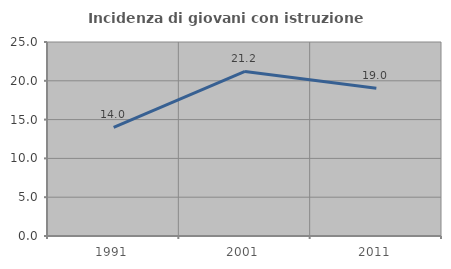
| Category | Incidenza di giovani con istruzione universitaria |
|---|---|
| 1991.0 | 14 |
| 2001.0 | 21.212 |
| 2011.0 | 19.048 |